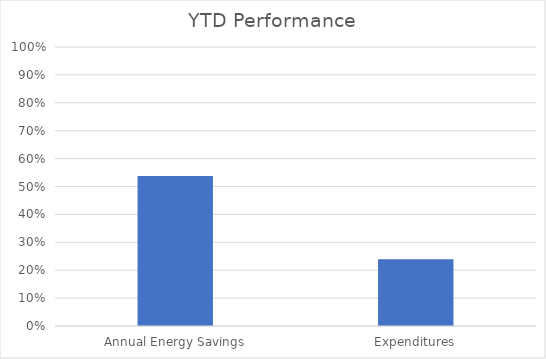
| Category | Series 0 |
|---|---|
| Annual Energy Savings | 0.537 |
| Expenditures | 0.24 |